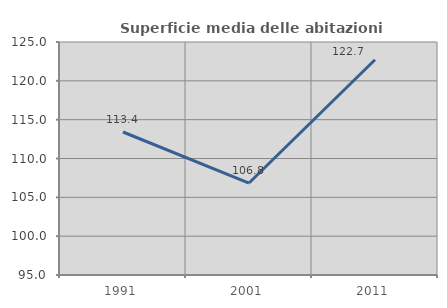
| Category | Superficie media delle abitazioni occupate |
|---|---|
| 1991.0 | 113.41 |
| 2001.0 | 106.839 |
| 2011.0 | 122.714 |